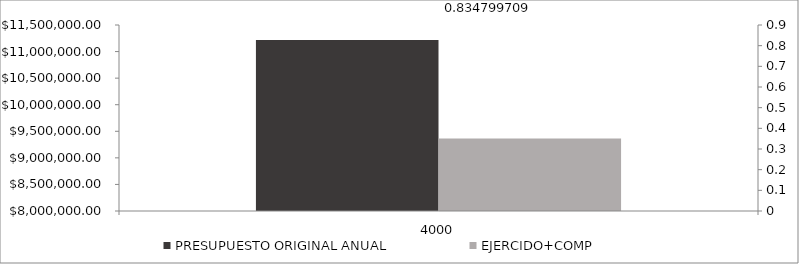
| Category | PRESUPUESTO ORIGINAL ANUAL | EJERCIDO+COMP |
|---|---|---|
| 4000.0 | 11217902.66 | 9364701.88 |